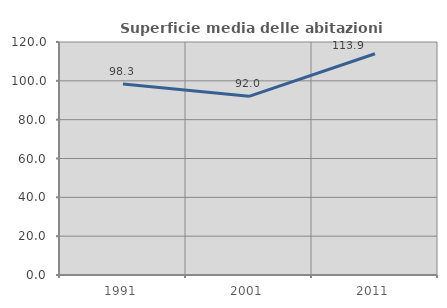
| Category | Superficie media delle abitazioni occupate |
|---|---|
| 1991.0 | 98.329 |
| 2001.0 | 92.016 |
| 2011.0 | 113.932 |